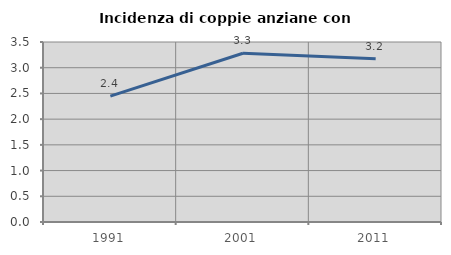
| Category | Incidenza di coppie anziane con figli |
|---|---|
| 1991.0 | 2.447 |
| 2001.0 | 3.281 |
| 2011.0 | 3.173 |